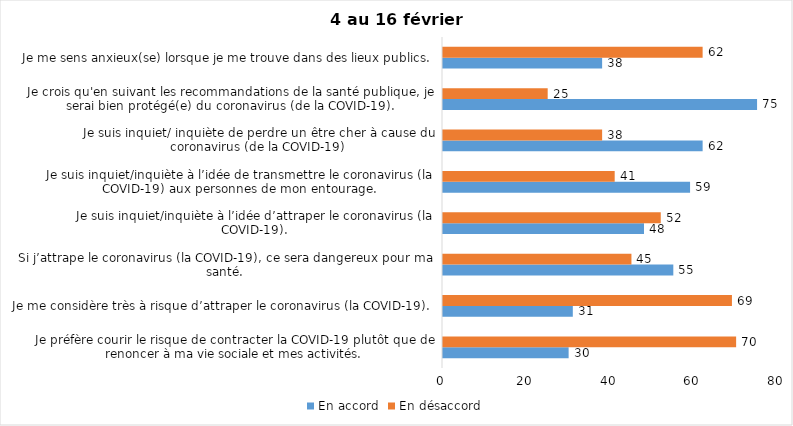
| Category | En accord | En désaccord |
|---|---|---|
| Je préfère courir le risque de contracter la COVID-19 plutôt que de renoncer à ma vie sociale et mes activités. | 30 | 70 |
| Je me considère très à risque d’attraper le coronavirus (la COVID-19). | 31 | 69 |
| Si j’attrape le coronavirus (la COVID-19), ce sera dangereux pour ma santé. | 55 | 45 |
| Je suis inquiet/inquiète à l’idée d’attraper le coronavirus (la COVID-19). | 48 | 52 |
| Je suis inquiet/inquiète à l’idée de transmettre le coronavirus (la COVID-19) aux personnes de mon entourage. | 59 | 41 |
| Je suis inquiet/ inquiète de perdre un être cher à cause du coronavirus (de la COVID-19) | 62 | 38 |
| Je crois qu'en suivant les recommandations de la santé publique, je serai bien protégé(e) du coronavirus (de la COVID-19). | 75 | 25 |
| Je me sens anxieux(se) lorsque je me trouve dans des lieux publics. | 38 | 62 |